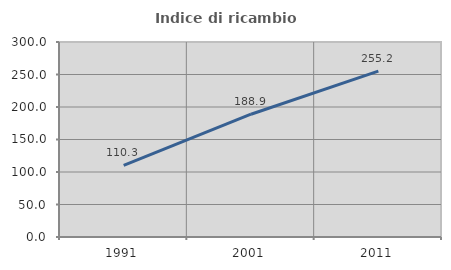
| Category | Indice di ricambio occupazionale  |
|---|---|
| 1991.0 | 110.256 |
| 2001.0 | 188.889 |
| 2011.0 | 255.172 |